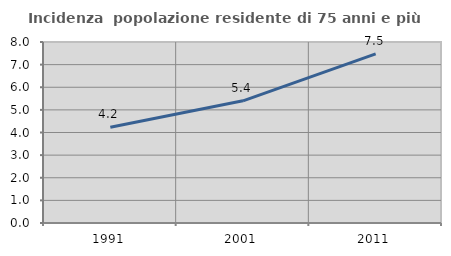
| Category | Incidenza  popolazione residente di 75 anni e più |
|---|---|
| 1991.0 | 4.236 |
| 2001.0 | 5.399 |
| 2011.0 | 7.473 |